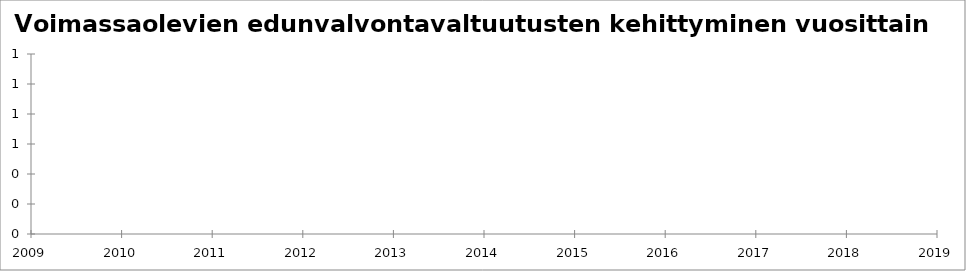
| Category | Series 0 |
|---|---|
| 2009 | 209 |
| 2010 | 405 |
| 2011 | 744 |
| 2012 | 1156 |
| 2013 | 1696 |
| 2014 | 2396 |
| 2015 | 3205 |
| 2016 | 4518 |
| 2017 | 6144 |
| 2018 | 7948 |
| 2019 | 10209 |